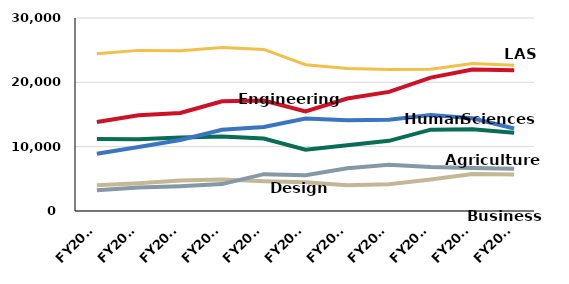
| Category | Agriculture and Life Sciences | Business | Design | Engineering | Human Sciences | Liberal Arts and Sciences |
|---|---|---|---|---|---|---|
| FY2007 | 11189 | 3998 | 3215 | 13834 | 8884 | 24440 |
| FY2008 | 11137 | 4324 | 3666 | 14892 | 9951 | 24967 |
| FY2009 | 11432 | 4758 | 3857 | 15230 | 11037 | 24928 |
| FY2010 | 11577 | 4896 | 4183 | 17050 | 12626 | 25421 |
| FY2011 | 11272 | 4626 | 5725 | 17181 | 13050 | 25117 |
| FY2012 | 9536 | 4483 | 5565 | 15487 | 14374 | 22729 |
| FY2013 | 10222 | 3987 | 6642 | 17484 | 14088 | 22156 |
| FY2014 | 10905 | 4173 | 7204 | 18520 | 14170 | 22000 |
| FY2015 | 12642.43 | 4905.4 | 6836.25 | 20741.12 | 14906.85 | 22033.27 |
| FY2016 | 12696.21 | 5767.24 | 6667.25 | 22006.55 | 14415.68 | 22910.29 |
| FY2017 | 12162.291 | 5691.7 | 6557.25 | 21877.035 | 12814.15 | 22667.988 |